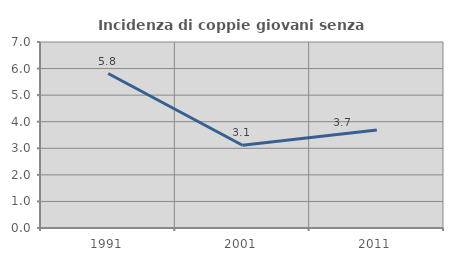
| Category | Incidenza di coppie giovani senza figli |
|---|---|
| 1991.0 | 5.814 |
| 2001.0 | 3.113 |
| 2011.0 | 3.689 |